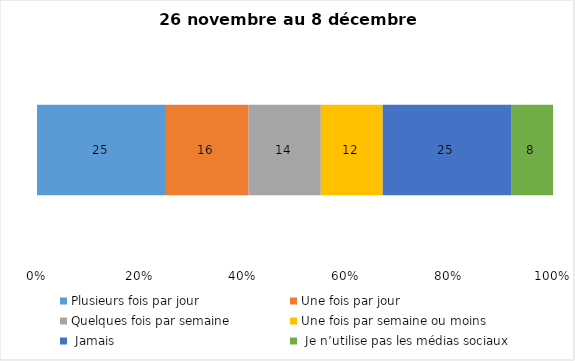
| Category | Plusieurs fois par jour | Une fois par jour | Quelques fois par semaine   | Une fois par semaine ou moins   |  Jamais   |  Je n’utilise pas les médias sociaux |
|---|---|---|---|---|---|---|
| 0 | 25 | 16 | 14 | 12 | 25 | 8 |